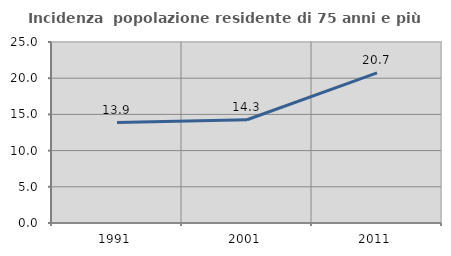
| Category | Incidenza  popolazione residente di 75 anni e più |
|---|---|
| 1991.0 | 13.875 |
| 2001.0 | 14.259 |
| 2011.0 | 20.732 |